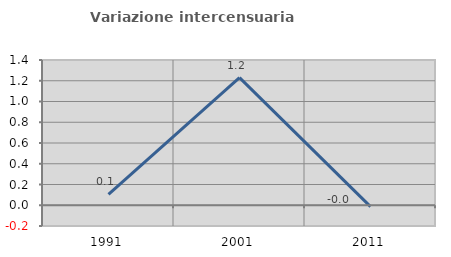
| Category | Variazione intercensuaria annua |
|---|---|
| 1991.0 | 0.104 |
| 2001.0 | 1.23 |
| 2011.0 | -0.013 |